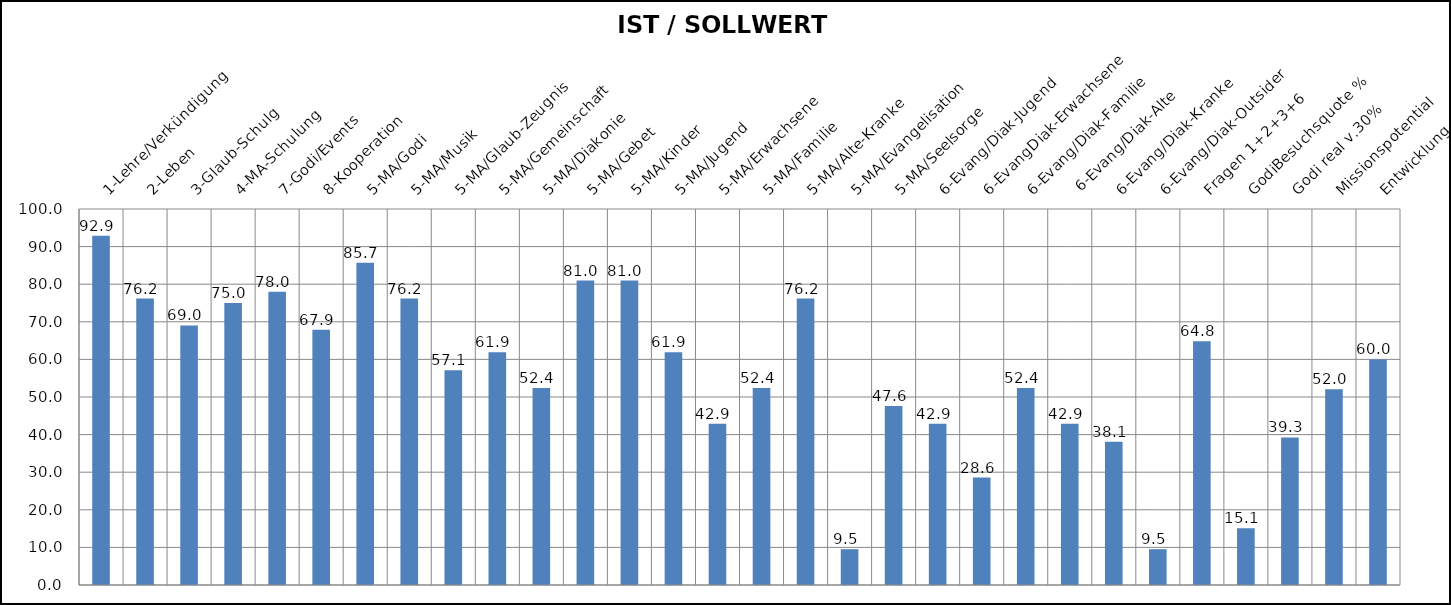
| Category | IST / SOLLWERT % |
|---|---|
| 1-Lehre/Verkündigung  | 92.857 |
| 2-Leben | 76.19 |
| 3-Glaub-Schulg | 69.048 |
| 4-MA-Schulung | 75 |
| 7-Godi/Events | 77.99 |
| 8-Kooperation | 67.857 |
| 5-MA/Godi | 85.714 |
| 5-MA/Musik | 76.19 |
| 5-MA/Glaub-Zeugnis | 57.143 |
| 5-MA/Gemeinschaft | 61.905 |
| 5-MA/Diakonie | 52.381 |
| 5-MA/Gebet | 80.952 |
| 5-MA/Kinder | 80.952 |
| 5-MA/Jugend | 61.905 |
| 5-MA/Erwachsene | 42.857 |
| 5-MA/Familie | 52.381 |
| 5-MA/Alte-Kranke | 76.19 |
| 5-MA/Evangelisation | 9.524 |
| 5-MA/Seelsorge | 47.619 |
| 6-Evang/Diak-Jugend | 42.857 |
| 6-EvangDiak-Erwachsene | 28.571 |
| 6-Evang/Diak-Familie | 52.381 |
|  6-Evang/Diak-Alte | 42.857 |
| 6-Evang/Diak-Kranke | 38.095 |
| 6-Evang/Diak-Outsider | 9.524 |
| Fragen 1+2+3+6 | 64.815 |
| GodiBesuchsquote % | 15.1 |
| Godi real v.30% | 39.255 |
| Missionspotential | 52.035 |
| Entwicklung | 59.977 |